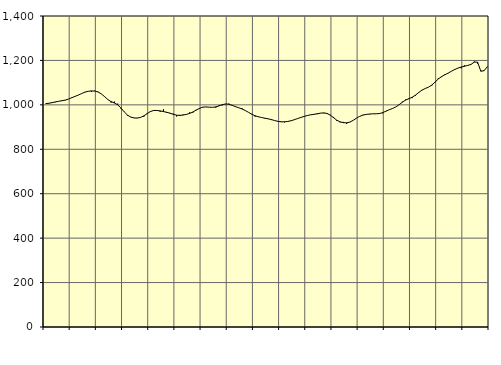
| Category | Piggar | Series 1 |
|---|---|---|
| nan | 1004.8 | 1005.51 |
| 87.0 | 1006.3 | 1007.26 |
| 87.0 | 1012.5 | 1010.03 |
| 87.0 | 1011.9 | 1013.34 |
| nan | 1016.5 | 1016.12 |
| 88.0 | 1019.9 | 1018.58 |
| 88.0 | 1020.4 | 1021.54 |
| 88.0 | 1026.1 | 1026.12 |
| nan | 1033.2 | 1032.2 |
| 89.0 | 1037.8 | 1038.21 |
| 89.0 | 1043.7 | 1044.15 |
| 89.0 | 1050.5 | 1050.85 |
| nan | 1058 | 1057.15 |
| 90.0 | 1061.3 | 1061.14 |
| 90.0 | 1059.1 | 1062.72 |
| 90.0 | 1063.6 | 1062.07 |
| nan | 1058.9 | 1058.08 |
| 91.0 | 1049.6 | 1049.64 |
| 91.0 | 1038.5 | 1037.22 |
| 91.0 | 1024.8 | 1024.09 |
| nan | 1010.1 | 1014.65 |
| 92.0 | 1014.7 | 1008.5 |
| 92.0 | 1005.3 | 1000.41 |
| 92.0 | 983.9 | 986.2 |
| nan | 969.5 | 968.64 |
| 93.0 | 951.6 | 954.05 |
| 93.0 | 946.1 | 944.99 |
| 93.0 | 941.9 | 941 |
| nan | 941.4 | 940.5 |
| 94.0 | 942.5 | 943.37 |
| 94.0 | 946.7 | 950.44 |
| 94.0 | 961.9 | 960.38 |
| nan | 967.7 | 969.74 |
| 95.0 | 976.5 | 974.57 |
| 95.0 | 975.6 | 974.82 |
| 95.0 | 968.8 | 972.82 |
| nan | 979.9 | 969.72 |
| 96.0 | 963.7 | 966.71 |
| 96.0 | 961.3 | 962.6 |
| 96.0 | 960.4 | 957.45 |
| nan | 947.8 | 953.65 |
| 97.0 | 955 | 952.32 |
| 97.0 | 956.2 | 954.07 |
| 97.0 | 955.9 | 957.08 |
| nan | 966.2 | 961.3 |
| 98.0 | 964.8 | 967.96 |
| 98.0 | 977.8 | 976.19 |
| 98.0 | 985.8 | 984.06 |
| nan | 990.5 | 989.47 |
| 99.0 | 990.5 | 990.64 |
| 99.0 | 989.4 | 989.43 |
| 99.0 | 988.8 | 988.86 |
| nan | 987.2 | 990.88 |
| 0.0 | 997.7 | 995.38 |
| 0.0 | 997.4 | 1000.78 |
| 0.0 | 1002.8 | 1004.08 |
| nan | 1005.5 | 1002.96 |
| 1.0 | 996.5 | 997.92 |
| 1.0 | 993.4 | 991.99 |
| 1.0 | 987.9 | 987.09 |
| nan | 984.8 | 981.61 |
| 2.0 | 973.7 | 974.58 |
| 2.0 | 966.1 | 966.24 |
| 2.0 | 959.3 | 957.79 |
| nan | 947.3 | 950.95 |
| 3.0 | 947.2 | 946.34 |
| 3.0 | 943.5 | 943.02 |
| 3.0 | 938.5 | 939.9 |
| nan | 936.5 | 937.07 |
| 4.0 | 931.6 | 933.67 |
| 4.0 | 929.2 | 929.4 |
| 4.0 | 923.6 | 925.66 |
| nan | 925.2 | 923.67 |
| 5.0 | 921.1 | 923.8 |
| 5.0 | 926.3 | 925.28 |
| 5.0 | 928.8 | 928.47 |
| nan | 932.4 | 933.1 |
| 6.0 | 937.7 | 938.26 |
| 6.0 | 944 | 943.36 |
| 6.0 | 948.2 | 947.87 |
| nan | 950.9 | 952.06 |
| 7.0 | 955.9 | 955.2 |
| 7.0 | 955.7 | 957.35 |
| 7.0 | 958.1 | 959.97 |
| nan | 963.4 | 962.69 |
| 8.0 | 961.8 | 963.87 |
| 8.0 | 959.5 | 961.27 |
| 8.0 | 955.2 | 953.58 |
| nan | 945.8 | 942.27 |
| 9.0 | 927.4 | 930.68 |
| 9.0 | 921.3 | 923.42 |
| 9.0 | 923.2 | 919.83 |
| nan | 914.3 | 919.07 |
| 10.0 | 921.8 | 922.42 |
| 10.0 | 929.9 | 930.3 |
| 10.0 | 940.1 | 940.01 |
| nan | 948.7 | 948.38 |
| 11.0 | 955.2 | 954.02 |
| 11.0 | 956.2 | 957.02 |
| 11.0 | 957.4 | 958.66 |
| nan | 959.6 | 959.64 |
| 12.0 | 959.7 | 959.79 |
| 12.0 | 959.4 | 960.88 |
| 12.0 | 962.2 | 964.83 |
| nan | 972.5 | 971.41 |
| 13.0 | 978.3 | 978.1 |
| 13.0 | 984.6 | 983.55 |
| 13.0 | 990.3 | 990.5 |
| nan | 1000.4 | 1000.42 |
| 14.0 | 1014.1 | 1011.8 |
| 14.0 | 1023.8 | 1021.3 |
| 14.0 | 1029.2 | 1027.7 |
| nan | 1030.4 | 1034.1 |
| 15.0 | 1040.8 | 1043.43 |
| 15.0 | 1054.2 | 1055.46 |
| 15.0 | 1067.3 | 1066.15 |
| nan | 1073.5 | 1073.62 |
| 16.0 | 1079.3 | 1079.6 |
| 16.0 | 1086.4 | 1088.89 |
| 16.0 | 1103 | 1102.3 |
| nan | 1119.8 | 1116.3 |
| 17.0 | 1124.7 | 1127.43 |
| 17.0 | 1137.5 | 1135.34 |
| 17.0 | 1141.9 | 1142.71 |
| nan | 1150.9 | 1151.21 |
| 18.0 | 1160.9 | 1158.97 |
| 18.0 | 1165.5 | 1165.41 |
| 18.0 | 1165 | 1170.34 |
| nan | 1177.7 | 1173.86 |
| 19.0 | 1179 | 1177.49 |
| 19.0 | 1181.5 | 1182.09 |
| 19.0 | 1195.1 | 1192.44 |
| nan | 1186 | 1192.39 |
| 20.0 | 1154.6 | 1151.43 |
| 20.0 | 1155.4 | 1153.58 |
| 20.0 | 1171.2 | 1172.14 |